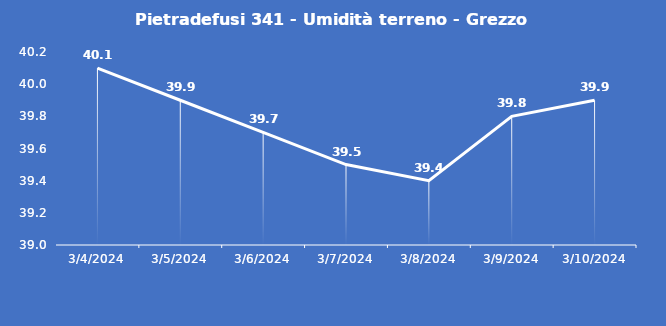
| Category | Pietradefusi 341 - Umidità terreno - Grezzo (%VWC) |
|---|---|
| 3/4/24 | 40.1 |
| 3/5/24 | 39.9 |
| 3/6/24 | 39.7 |
| 3/7/24 | 39.5 |
| 3/8/24 | 39.4 |
| 3/9/24 | 39.8 |
| 3/10/24 | 39.9 |